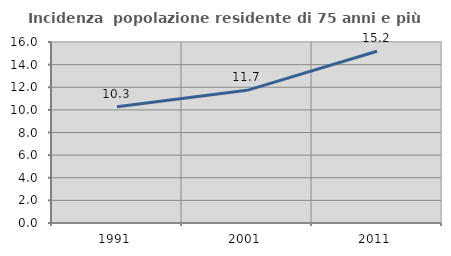
| Category | Incidenza  popolazione residente di 75 anni e più |
|---|---|
| 1991.0 | 10.276 |
| 2001.0 | 11.728 |
| 2011.0 | 15.18 |